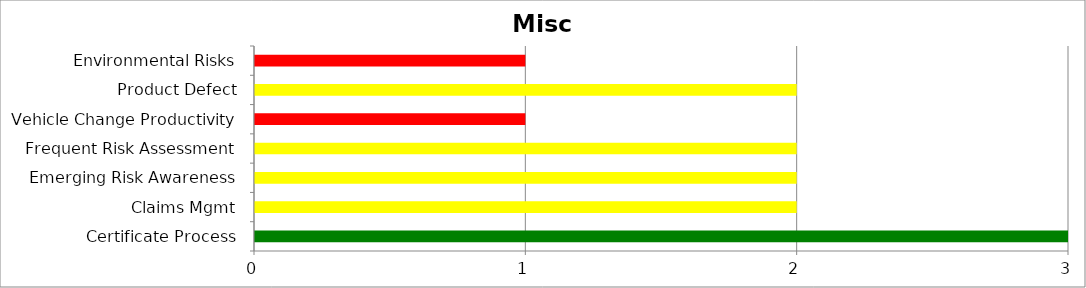
| Category | Low | Medium | High |
|---|---|---|---|
| Certificate Process | 3 | 0 | 0 |
| Claims Mgmt | 0 | 2 | 0 |
| Emerging Risk Awareness | 0 | 2 | 0 |
| Frequent Risk Assessment | 0 | 2 | 0 |
| Vehicle Change Productivity | 0 | 0 | 1 |
| Product Defect | 0 | 2 | 0 |
| Environmental Risks | 0 | 0 | 1 |